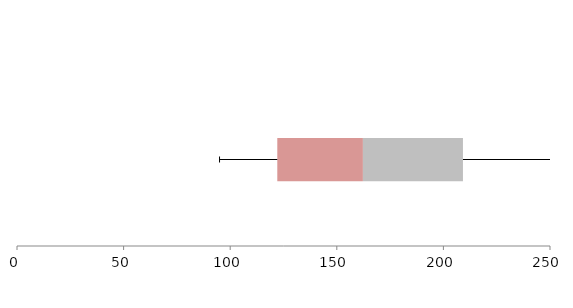
| Category | Series 1 | Series 2 | Series 3 |
|---|---|---|---|
| 0 | 122.09 | 40.159 | 46.922 |